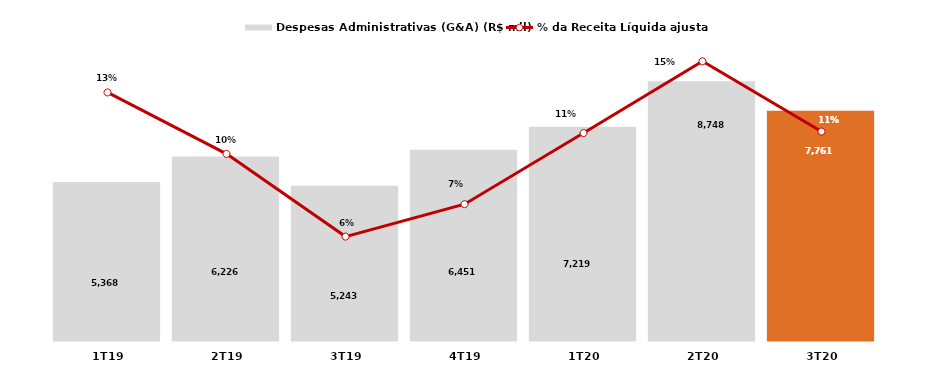
| Category | Despesas Administrativas (G&A) (R$ mil) |
|---|---|
| 1T19 | 5368 |
| 2T19 | 6226 |
| 3T19 | 5243 |
| 4T19 | 6451 |
| 1T20 | 7219 |
| 2T20 | 8748 |
| 3T20 | 7761 |